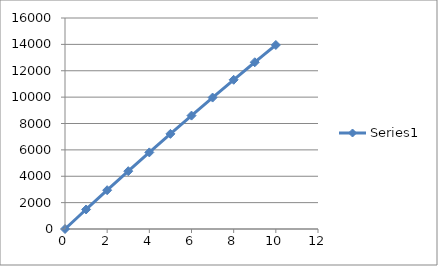
| Category | Series 0 |
|---|---|
| 0.0 | 0 |
| 1.0 | 1480.54 |
| 2.0 | 2942.16 |
| 3.0 | 4384.86 |
| 4.0 | 5808.64 |
| 5.0 | 7213.5 |
| 6.0 | 8599.44 |
| 7.0 | 9966.46 |
| 8.0 | 11314.56 |
| 9.0 | 12643.74 |
| 10.0 | 13954 |